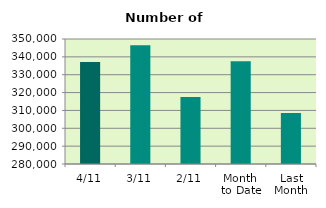
| Category | Series 0 |
|---|---|
| 4/11 | 337110 |
| 3/11 | 346550 |
| 2/11 | 317576 |
| Month 
to Date | 337534.5 |
| Last
Month | 308508.19 |